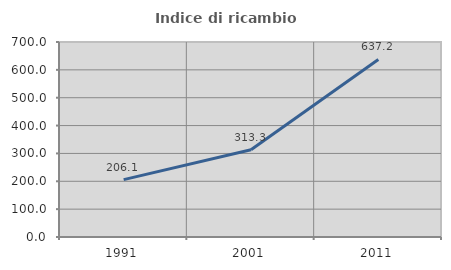
| Category | Indice di ricambio occupazionale  |
|---|---|
| 1991.0 | 206.061 |
| 2001.0 | 313.276 |
| 2011.0 | 637.209 |